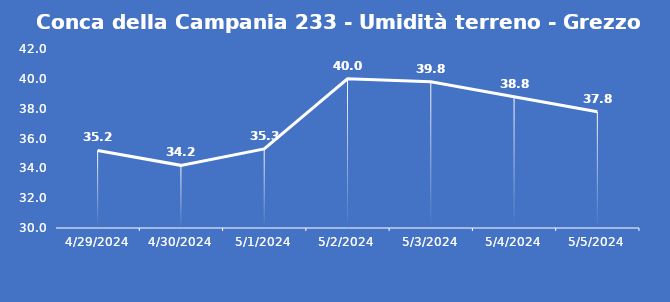
| Category | Conca della Campania 233 - Umidità terreno - Grezzo (%VWC) |
|---|---|
| 4/29/24 | 35.2 |
| 4/30/24 | 34.2 |
| 5/1/24 | 35.3 |
| 5/2/24 | 40 |
| 5/3/24 | 39.8 |
| 5/4/24 | 38.8 |
| 5/5/24 | 37.8 |